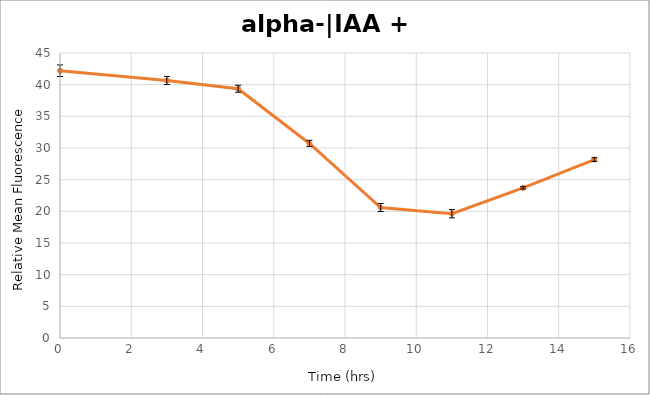
| Category | Average |
|---|---|
| 0.0 | 42.204 |
| 3.0 | 40.661 |
| 5.0 | 39.36 |
| 7.0 | 30.719 |
| 9.0 | 20.602 |
| 11.0 | 19.627 |
| 13.0 | 23.706 |
| 15.0 | 28.178 |